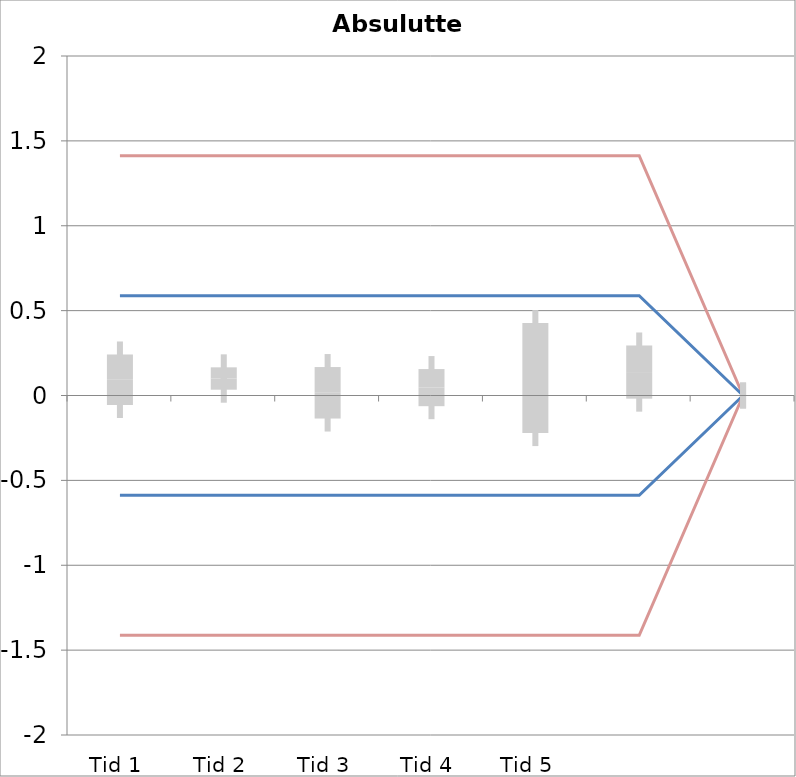
| Category | 1 | 2 | 3 | 4 | 5 | 6 | 7 | 8 | 9 | 10 | 11 | 12 | 13 | 14 | 15 | 16 | 17 | 18 | 19 | 20 | TEa | B | -B | -TEa | M |
|---|---|---|---|---|---|---|---|---|---|---|---|---|---|---|---|---|---|---|---|---|---|---|---|---|---|
| Tid 1 | 0.14 | 0.42 | 0.16 | 0 | -0.16 | -0.17 | 0 | -0.03 | 0.06 | 0.05 | 0.55 | 0 | 0 | 0 | 0 | 0 | 0 | 0 | 0 | 0 | 1.413 | 0.588 | -0.588 | -1.413 | 0.093 |
| Tid 2 | -0.03 | 0 | 0.18 | 0.19 | 0.02 | 0.08 | 0.13 | -0.01 | 0.08 | 0.21 | 0.25 | 0 | 0 | 0 | 0 | 0 | 0 | 0 | 0 | 0 | 1.413 | 0.588 | -0.588 | -1.413 | 0.1 |
| Tid 3 | 0 | -0.36 | -0.04 | 0.06 | 0.23 | -0.11 | -0.09 | -0.14 | 0.39 | 0.07 | 0.15 | 0 | 0 | 0 | 0 | 0 | 0 | 0 | 0 | 0 | 1.413 | 0.588 | -0.588 | -1.413 | 0.016 |
| Tid 4 | 0 | -0.03 | 0.05 | 0.06 | -0.27 | -0.04 | 0.07 | -0.04 | 0.3 | 0.09 | 0.32 | 0 | 0 | 0 | 0 | 0 | 0 | 0 | 0 | 0 | 1.413 | 0.588 | -0.588 | -1.413 | 0.046 |
| Tid 5  | 0 | 0 | 0 | 0 | 0 | 0 | 0 | 0.05 | -0.09 | 0.06 | 0.39 | 0 | 0 | 0 | 0 | 0 | 0 | 0 | 0 | 0 | 1.413 | 0.588 | -0.588 | -1.413 | 0.103 |